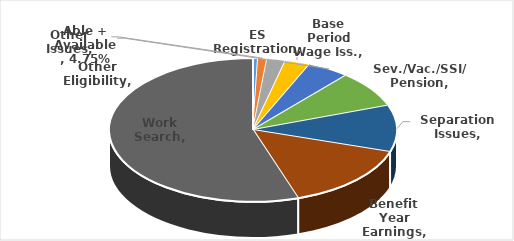
| Category | Series 0 |
|---|---|
| ES Registration | 0.006 |
| Other Issues | 0.01 |
| Other Eligibility | 0.021 |
| Base Period Wage Iss. | 0.028 |
| Able + Available | 0.048 |
| Sev./Vac./SSI/ Pension | 0.082 |
| Separation Issues | 0.105 |
| Benefit Year Earnings | 0.15 |
| Work Search | 0.551 |